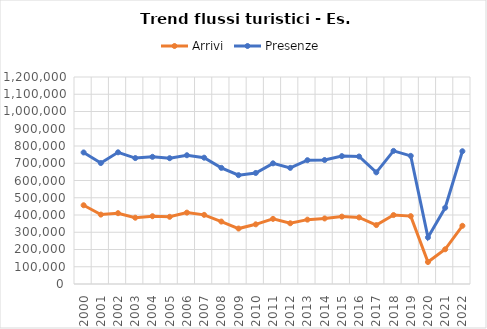
| Category | Arrivi | Presenze |
|---|---|---|
| 2000.0 | 456531 | 762554 |
| 2001.0 | 402432 | 701183 |
| 2002.0 | 410505 | 763389 |
| 2003.0 | 384325 | 729993 |
| 2004.0 | 392848 | 737320 |
| 2005.0 | 389559 | 729323 |
| 2006.0 | 413794 | 746430 |
| 2007.0 | 400845 | 732281 |
| 2008.0 | 361936 | 673192 |
| 2009.0 | 321390 | 631030 |
| 2010.0 | 345936 | 643724 |
| 2011.0 | 377552 | 699428 |
| 2012.0 | 352076 | 673230 |
| 2013.0 | 373099 | 717716 |
| 2014.0 | 379974 | 718705 |
| 2015.0 | 390735 | 741407 |
| 2016.0 | 385834 | 739106 |
| 2017.0 | 341628 | 647216 |
| 2018.0 | 399608 | 771598 |
| 2019.0 | 393520 | 742911 |
| 2020.0 | 127328 | 270171 |
| 2021.0 | 201212 | 441745 |
| 2022.0 | 337339 | 769570 |